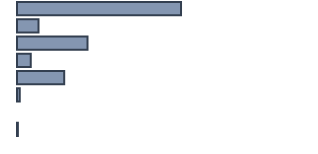
| Category | Series 0 |
|---|---|
| 0 | 55.6 |
| 1 | 7.3 |
| 2 | 23.9 |
| 3 | 4.7 |
| 4 | 16 |
| 5 | 0.9 |
| 6 | 0 |
| 7 | 0.3 |